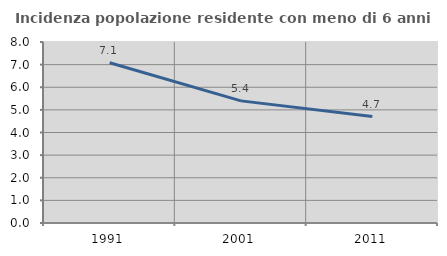
| Category | Incidenza popolazione residente con meno di 6 anni |
|---|---|
| 1991.0 | 7.082 |
| 2001.0 | 5.398 |
| 2011.0 | 4.706 |